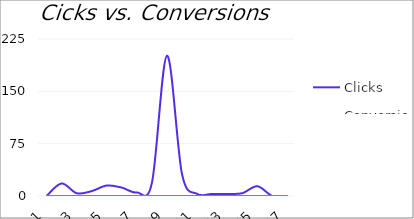
| Category | Clicks | Conversions |
|---|---|---|
| 1 | 0 | 0 |
| 2 | 18 | 0 |
| 3 | 4 | 0 |
| 4 | 7 | 0 |
| 5 | 15 | 0 |
| 6 | 12 | 0 |
| 7 | 5 | 0 |
| 8 | 19 | 0 |
| 9 | 201 | 0 |
| 10 | 31 | 0 |
| 11 | 3 | 0 |
| 12 | 3 | 0 |
| 13 | 3 | 0 |
| 14 | 4 | 0 |
| 15 | 14 | 0 |
| 16 | 0 | 0 |
| 17 | 0 | 0 |